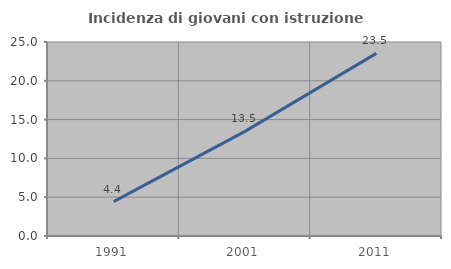
| Category | Incidenza di giovani con istruzione universitaria |
|---|---|
| 1991.0 | 4.425 |
| 2001.0 | 13.483 |
| 2011.0 | 23.529 |